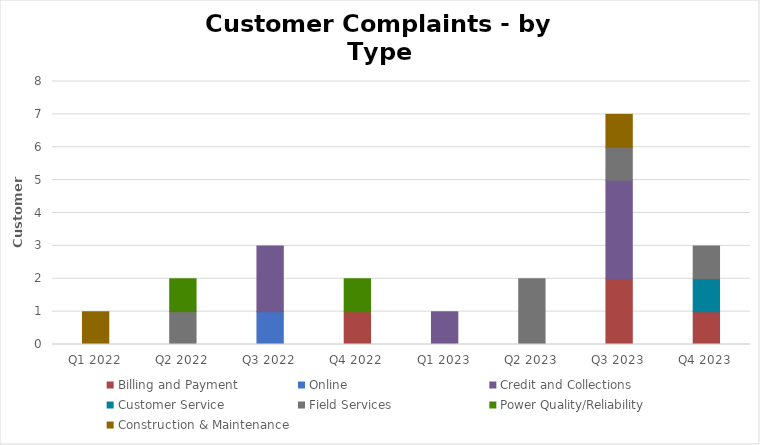
| Category | Billing and Payment | Online | Credit and Collections | Customer Service | Field Services | Power Quality/Reliability | Construction & Maintenance |
|---|---|---|---|---|---|---|---|
| Q1 2022 | 0 | 0 | 0 | 0 | 0 | 0 | 1 |
| Q2 2022 | 0 | 0 | 0 | 0 | 1 | 1 | 0 |
| Q3 2022 | 0 | 1 | 2 | 0 | 0 | 0 | 0 |
| Q4 2022 | 1 | 0 | 0 | 0 | 0 | 1 | 0 |
| Q1 2023 | 0 | 0 | 1 | 0 | 0 | 0 | 0 |
| Q2 2023 | 0 | 0 | 0 | 0 | 2 | 0 | 0 |
| Q3 2023 | 2 | 0 | 3 | 0 | 1 | 0 | 1 |
| Q4 2023 | 1 | 0 | 0 | 1 | 1 | 0 | 0 |